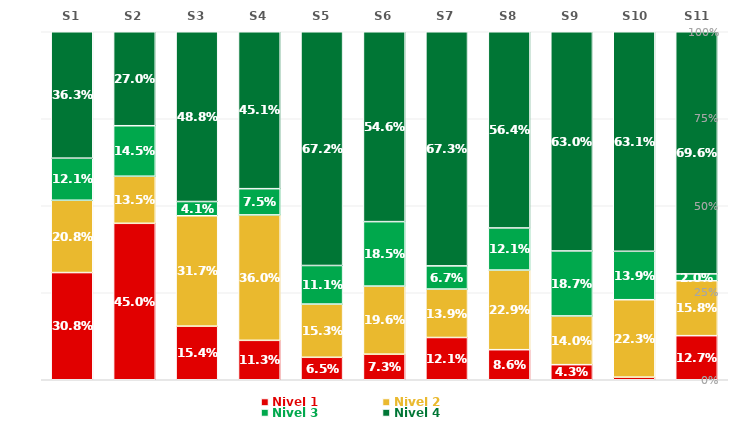
| Category | Nivel 1 | Nivel 2 | Nivel 3 | Nivel 4 |
|---|---|---|---|---|
| S1 | 0.308 | 0.208 | 0.121 | 0.363 |
| S2 | 0.45 | 0.135 | 0.145 | 0.27 |
| S3 | 0.154 | 0.317 | 0.041 | 0.488 |
| S4 | 0.113 | 0.36 | 0.075 | 0.451 |
| S5 | 0.065 | 0.153 | 0.111 | 0.672 |
| S6 | 0.073 | 0.196 | 0.185 | 0.546 |
| S7 | 0.121 | 0.139 | 0.067 | 0.673 |
| S8 | 0.086 | 0.229 | 0.121 | 0.564 |
| S9 | 0.043 | 0.14 | 0.187 | 0.63 |
| S10 | 0.007 | 0.223 | 0.139 | 0.631 |
| S11 | 0.127 | 0.158 | 0.02 | 0.696 |